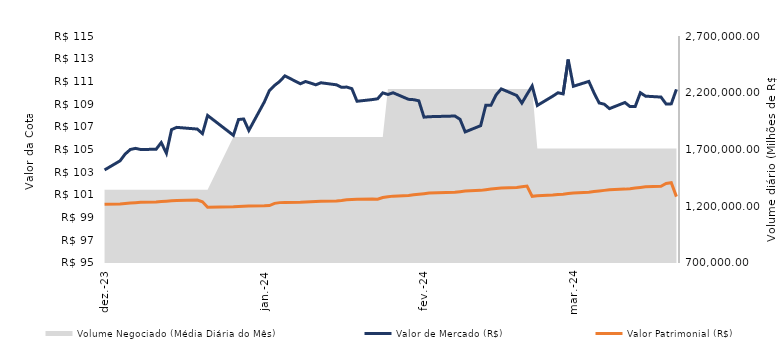
| Category | Valor de Mercado (R$) | Valor Patrimonial (R$) |
|---|---|---|
| 3/28/24 | 110.3 | 100.849 |
| 3/27/24 | 109.02 | 102.072 |
| 3/26/24 | 109.01 | 102.009 |
| 3/25/24 | 109.62 | 101.764 |
| 3/22/24 | 109.7 | 101.709 |
| 3/21/24 | 110 | 101.655 |
| 3/20/24 | 108.79 | 101.603 |
| 3/19/24 | 108.78 | 101.547 |
| 3/18/24 | 109.14 | 101.509 |
| 3/15/24 | 108.6 | 101.453 |
| 3/14/24 | 108.99 | 101.398 |
| 3/13/24 | 109.1 | 101.351 |
| 3/12/24 | 109.99 | 101.295 |
| 3/11/24 | 111 | 101.239 |
| 3/8/24 | 110.57 | 101.174 |
| 3/7/24 | 112.93 | 101.123 |
| 3/6/24 | 109.9 | 101.067 |
| 3/5/24 | 110 | 101.037 |
| 3/4/24 | 109.7 | 100.983 |
| 3/1/24 | 108.88 | 100.927 |
| 2/29/24 | 110.6 | 100.873 |
| 2/28/24 | 109.86 | 101.78 |
| 2/27/24 | 109.09 | 101.714 |
| 2/26/24 | 109.76 | 101.656 |
| 2/23/24 | 110.34 | 101.614 |
| 2/22/24 | 109.81 | 101.572 |
| 2/21/24 | 108.89 | 101.514 |
| 2/20/24 | 108.9 | 101.457 |
| 2/19/24 | 107.1 | 101.399 |
| 2/16/24 | 106.55 | 101.342 |
| 2/15/24 | 107.66 | 101.284 |
| 2/14/24 | 107.95 | 101.227 |
| 2/9/24 | 107.89 | 101.169 |
| 2/8/24 | 107.85 | 101.111 |
| 2/7/24 | 109.29 | 101.063 |
| 2/6/24 | 109.39 | 101.005 |
| 2/5/24 | 109.42 | 100.95 |
| 2/2/24 | 110 | 100.892 |
| 2/1/24 | 109.85 | 100.834 |
| 1/31/24 | 109.99 | 100.774 |
| 1/30/24 | 109.47 | 100.627 |
| 1/29/24 | 109.4 | 100.631 |
| 1/26/24 | 109.25 | 100.61 |
| 1/25/24 | 110.36 | 100.589 |
| 1/24/24 | 110.5 | 100.572 |
| 1/23/24 | 110.48 | 100.509 |
| 1/22/24 | 110.7 | 100.467 |
| 1/19/24 | 110.88 | 100.446 |
| 1/18/24 | 110.7 | 100.425 |
| 1/17/24 | 110.85 | 100.404 |
| 1/16/24 | 110.99 | 100.383 |
| 1/15/24 | 110.79 | 100.362 |
| 1/12/24 | 111.49 | 100.341 |
| 1/11/24 | 111 | 100.32 |
| 1/10/24 | 110.65 | 100.257 |
| 1/9/24 | 110.2 | 100.059 |
| 1/8/24 | 109.18 | 100.038 |
| 1/5/24 | 106.68 | 100.017 |
| 1/4/24 | 107.69 | 99.996 |
| 1/3/24 | 107.64 | 99.975 |
| 1/2/24 | 106.25 | 99.954 |
| 12/28/23 | 108 | 99.912 |
| 12/27/23 | 106.4 | 100.394 |
| 12/26/23 | 106.8 | 100.547 |
| 12/22/23 | 106.95 | 100.513 |
| 12/21/23 | 106.75 | 100.478 |
| 12/20/23 | 104.67 | 100.444 |
| 12/19/23 | 105.61 | 100.418 |
| 12/18/23 | 105.02 | 100.383 |
| 12/15/23 | 105 | 100.349 |
| 12/14/23 | 105.1 | 100.315 |
| 12/13/23 | 105 | 100.28 |
| 12/12/23 | 104.6 | 100.244 |
| 12/11/23 | 104 | 100.208 |
| 12/8/23 | 103.2 | 100.173 |